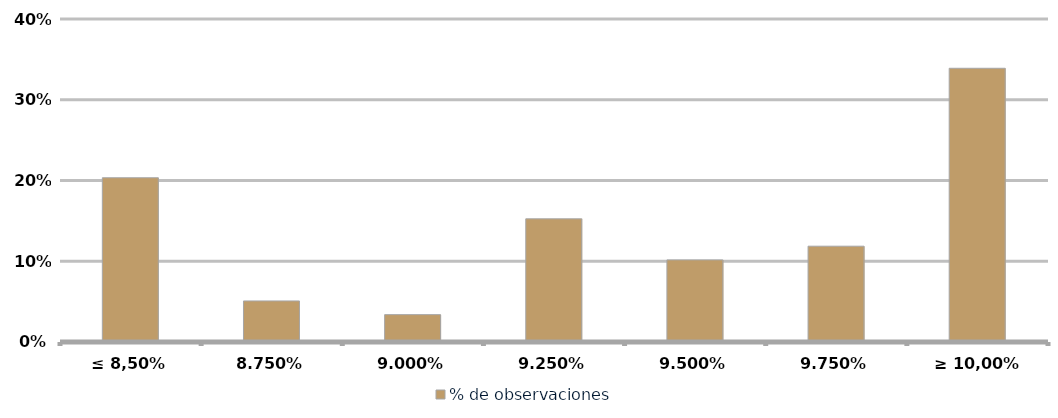
| Category | % de observaciones  |
|---|---|
| ≤ 8,50% | 0.203 |
| 8,75% | 0.051 |
| 9,00% | 0.034 |
| 9,25% | 0.153 |
| 9,50% | 0.102 |
| 9,75% | 0.119 |
| ≥ 10,00% | 0.339 |